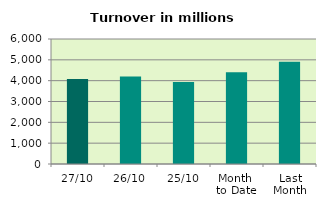
| Category | Series 0 |
|---|---|
| 27/10 | 4084.857 |
| 26/10 | 4198.966 |
| 25/10 | 3939.255 |
| Month 
to Date | 4398.188 |
| Last
Month | 4910.879 |